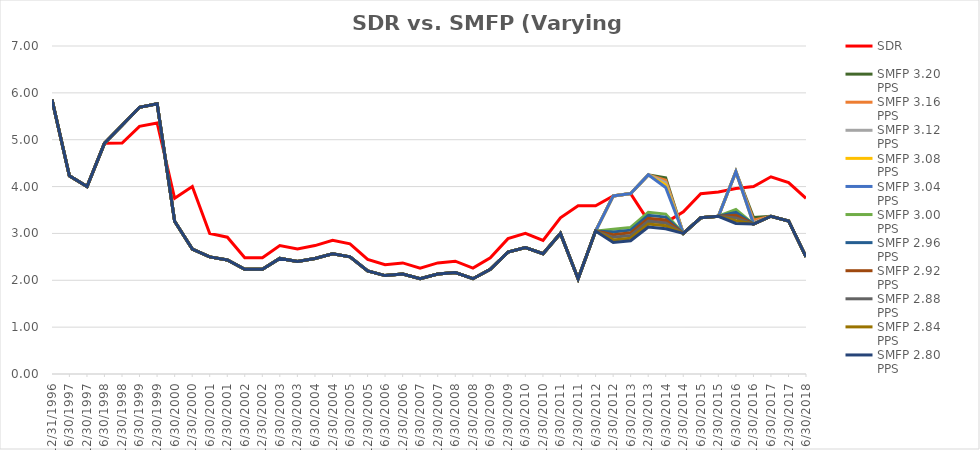
| Category | SDR | SMFP 3.20 PPS | SMFP 3.16 PPS | SMFP 3.12 PPS | SMFP 3.08 PPS | SMFP 3.04 PPS | SMFP 3.00 PPS | SMFP 2.96 PPS | SMFP 2.92 PPS | SMFP 2.88 PPS | SMFP 2.84 PPS | SMFP 2.80 PPS |
|---|---|---|---|---|---|---|---|---|---|---|---|---|
| 12/31/96 | 5.857 | 5.857 | 5.857 | 5.857 | 5.857 | 5.857 | 5.857 | 5.857 | 5.857 | 5.857 | 5.857 | 5.857 |
| 6/30/97 | 4.231 | 4.231 | 4.231 | 4.231 | 4.231 | 4.231 | 4.231 | 4.231 | 4.231 | 4.231 | 4.231 | 4.231 |
| 12/31/97 | 4 | 4 | 4 | 4 | 4 | 4 | 4 | 4 | 4 | 4 | 4 | 4 |
| 6/30/98 | 4.923 | 4.923 | 4.923 | 4.923 | 4.923 | 4.923 | 4.923 | 4.923 | 4.923 | 4.923 | 4.923 | 4.923 |
| 12/31/98 | 4.929 | 5.308 | 5.308 | 5.308 | 5.308 | 5.308 | 5.308 | 5.308 | 5.308 | 5.308 | 5.308 | 5.308 |
| 6/30/99 | 5.286 | 5.692 | 5.692 | 5.692 | 5.692 | 5.692 | 5.692 | 5.692 | 5.692 | 5.692 | 5.692 | 5.692 |
| 12/31/99 | 5.357 | 5.769 | 5.769 | 5.769 | 5.769 | 5.769 | 5.769 | 5.769 | 5.769 | 5.769 | 5.769 | 5.769 |
| 6/30/00 | 3.75 | 3.261 | 3.261 | 3.261 | 3.261 | 3.261 | 3.261 | 3.261 | 3.261 | 3.261 | 3.261 | 3.261 |
| 12/31/00 | 4 | 2.667 | 2.667 | 2.667 | 2.667 | 2.667 | 2.667 | 2.667 | 2.667 | 2.667 | 2.667 | 2.667 |
| 6/30/01 | 3 | 2.5 | 2.5 | 2.5 | 2.5 | 2.5 | 2.5 | 2.5 | 2.5 | 2.5 | 2.5 | 2.5 |
| 12/31/01 | 2.92 | 2.433 | 2.433 | 2.433 | 2.433 | 2.433 | 2.433 | 2.433 | 2.433 | 2.433 | 2.433 | 2.433 |
| 6/30/02 | 2.481 | 2.233 | 2.233 | 2.233 | 2.233 | 2.233 | 2.233 | 2.233 | 2.233 | 2.233 | 2.233 | 2.233 |
| 12/31/02 | 2.481 | 2.233 | 2.233 | 2.233 | 2.233 | 2.233 | 2.233 | 2.233 | 2.233 | 2.233 | 2.233 | 2.233 |
| 6/30/03 | 2.741 | 2.467 | 2.467 | 2.467 | 2.467 | 2.467 | 2.467 | 2.467 | 2.467 | 2.467 | 2.467 | 2.467 |
| 12/31/03 | 2.667 | 2.4 | 2.4 | 2.4 | 2.4 | 2.4 | 2.4 | 2.4 | 2.4 | 2.4 | 2.4 | 2.4 |
| 6/30/04 | 2.741 | 2.467 | 2.467 | 2.467 | 2.467 | 2.467 | 2.467 | 2.467 | 2.467 | 2.467 | 2.467 | 2.467 |
| 12/31/04 | 2.852 | 2.567 | 2.567 | 2.567 | 2.567 | 2.567 | 2.567 | 2.567 | 2.567 | 2.567 | 2.567 | 2.567 |
| 6/30/05 | 2.778 | 2.5 | 2.5 | 2.5 | 2.5 | 2.5 | 2.5 | 2.5 | 2.5 | 2.5 | 2.5 | 2.5 |
| 12/31/05 | 2.444 | 2.2 | 2.2 | 2.2 | 2.2 | 2.2 | 2.2 | 2.2 | 2.2 | 2.2 | 2.2 | 2.2 |
| 6/30/06 | 2.333 | 2.1 | 2.1 | 2.1 | 2.1 | 2.1 | 2.1 | 2.1 | 2.1 | 2.1 | 2.1 | 2.1 |
| 12/31/06 | 2.37 | 2.133 | 2.133 | 2.133 | 2.133 | 2.133 | 2.133 | 2.133 | 2.133 | 2.133 | 2.133 | 2.133 |
| 6/30/07 | 2.259 | 2.033 | 2.033 | 2.033 | 2.033 | 2.033 | 2.033 | 2.033 | 2.033 | 2.033 | 2.033 | 2.033 |
| 12/31/07 | 2.37 | 2.133 | 2.133 | 2.133 | 2.133 | 2.133 | 2.133 | 2.133 | 2.133 | 2.133 | 2.133 | 2.133 |
| 6/30/08 | 2.407 | 2.167 | 2.167 | 2.167 | 2.167 | 2.167 | 2.167 | 2.167 | 2.167 | 2.167 | 2.167 | 2.167 |
| 12/31/08 | 2.259 | 2.033 | 2.033 | 2.033 | 2.033 | 2.033 | 2.033 | 2.033 | 2.033 | 2.033 | 2.033 | 2.033 |
| 6/30/09 | 2.481 | 2.233 | 2.233 | 2.233 | 2.233 | 2.233 | 2.233 | 2.233 | 2.233 | 2.233 | 2.233 | 2.233 |
| 12/31/09 | 2.889 | 2.6 | 2.6 | 2.6 | 2.6 | 2.6 | 2.6 | 2.6 | 2.6 | 2.6 | 2.6 | 2.6 |
| 6/30/10 | 3 | 2.7 | 2.7 | 2.7 | 2.7 | 2.7 | 2.7 | 2.7 | 2.7 | 2.7 | 2.7 | 2.7 |
| 12/31/10 | 2.852 | 2.567 | 2.567 | 2.567 | 2.567 | 2.567 | 2.567 | 2.567 | 2.567 | 2.567 | 2.567 | 2.567 |
| 6/30/11 | 3.333 | 3 | 3 | 3 | 3 | 3 | 3 | 3 | 3 | 3 | 3 | 3 |
| 12/31/11 | 3.588 | 2.033 | 2.033 | 2.033 | 2.033 | 2.033 | 2.033 | 2.033 | 2.033 | 2.033 | 2.033 | 2.033 |
| 6/30/12 | 3.588 | 3.05 | 3.05 | 3.05 | 3.05 | 3.05 | 3.05 | 3.05 | 3.05 | 3.05 | 3.05 | 3.05 |
| 12/31/12 | 3.8 | 3.8 | 3.8 | 3.8 | 3.8 | 3.8 | 3.088 | 3.03 | 2.973 | 2.917 | 2.861 | 2.806 |
| 6/30/13 | 3.85 | 3.85 | 3.85 | 3.85 | 3.85 | 3.85 | 3.128 | 3.07 | 3.012 | 2.955 | 2.898 | 2.843 |
| 12/31/13 | 3.269 | 4.25 | 4.25 | 4.25 | 4.25 | 4.25 | 3.453 | 3.389 | 3.325 | 3.262 | 3.2 | 3.138 |
| 6/30/14 | 3.231 | 4.188 | 4.136 | 4.084 | 4.031 | 3.979 | 3.412 | 3.349 | 3.286 | 3.224 | 3.162 | 3.101 |
| 12/31/14 | 3.462 | 3 | 3 | 3 | 3 | 3 | 3 | 3 | 3 | 3 | 3 | 3 |
| 6/30/15 | 3.846 | 3.333 | 3.333 | 3.333 | 3.333 | 3.333 | 3.333 | 3.333 | 3.333 | 3.333 | 3.333 | 3.333 |
| 12/31/15 | 3.885 | 3.367 | 3.367 | 3.367 | 3.367 | 3.367 | 3.367 | 3.367 | 3.367 | 3.367 | 3.367 | 3.367 |
| 6/30/16 | 3.958 | 4.318 | 4.318 | 4.318 | 4.318 | 4.318 | 3.51 | 3.45 | 3.39 | 3.33 | 3.271 | 3.213 |
| 12/31/16 | 4 | 3.337 | 3.284 | 3.232 | 3.2 | 3.2 | 3.2 | 3.2 | 3.2 | 3.2 | 3.2 | 3.2 |
| 6/30/17 | 4.208 | 3.367 | 3.367 | 3.367 | 3.367 | 3.367 | 3.367 | 3.367 | 3.367 | 3.367 | 3.367 | 3.367 |
| 12/31/17 | 4.083 | 3.267 | 3.267 | 3.267 | 3.267 | 3.267 | 3.267 | 3.267 | 3.267 | 3.267 | 3.267 | 3.267 |
| 6/30/18 | 3.75 | 2.5 | 2.5 | 2.5 | 2.5 | 2.5 | 2.5 | 2.5 | 2.5 | 2.5 | 2.5 | 2.5 |